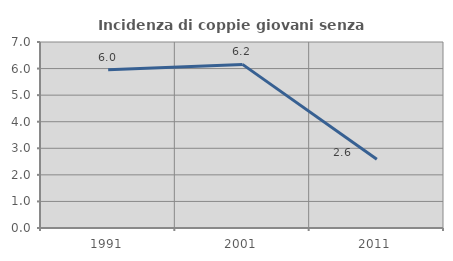
| Category | Incidenza di coppie giovani senza figli |
|---|---|
| 1991.0 | 5.958 |
| 2001.0 | 6.157 |
| 2011.0 | 2.591 |